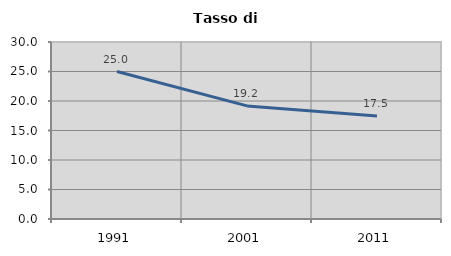
| Category | Tasso di disoccupazione   |
|---|---|
| 1991.0 | 25 |
| 2001.0 | 19.167 |
| 2011.0 | 17.476 |